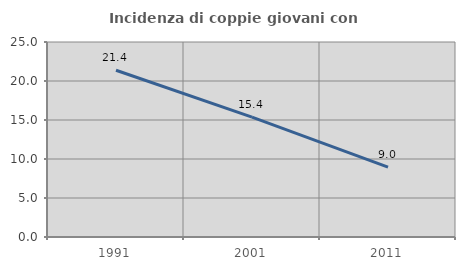
| Category | Incidenza di coppie giovani con figli |
|---|---|
| 1991.0 | 21.378 |
| 2001.0 | 15.365 |
| 2011.0 | 8.967 |